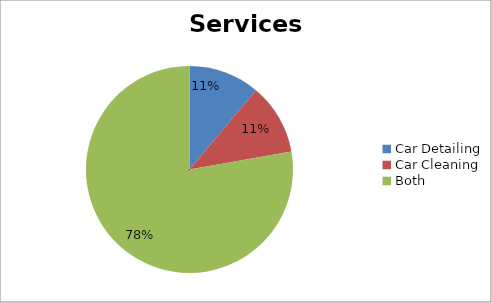
| Category | Series 0 |
|---|---|
| Car Detailing | 1 |
| Car Cleaning | 1 |
| Both | 7 |